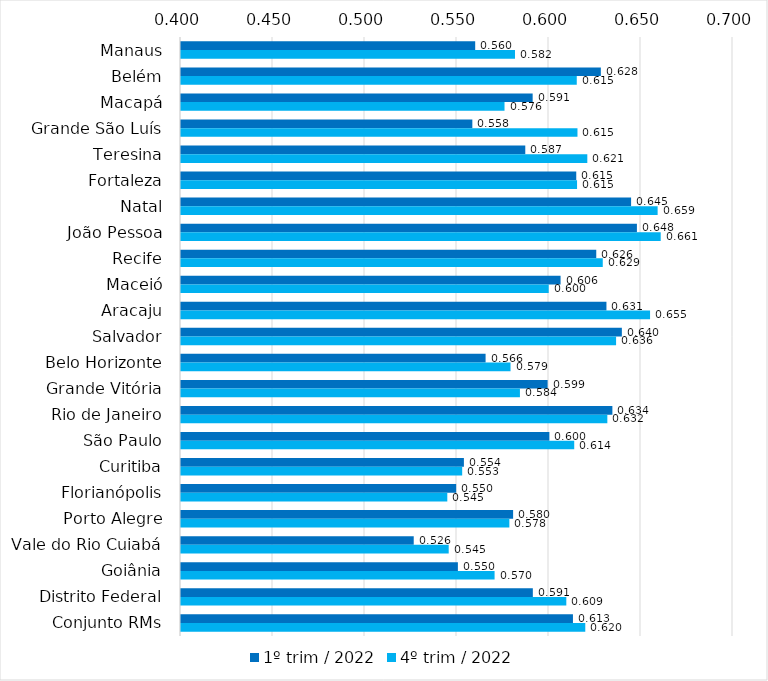
| Category | 1º trim / 2022 | 4º trim / 2022 |
|---|---|---|
| Manaus | 0.56 | 0.582 |
| Belém | 0.628 | 0.615 |
| Macapá | 0.591 | 0.576 |
| Grande São Luís | 0.558 | 0.615 |
| Teresina | 0.587 | 0.621 |
| Fortaleza | 0.615 | 0.615 |
| Natal | 0.645 | 0.659 |
| João Pessoa | 0.648 | 0.661 |
| Recife | 0.626 | 0.629 |
| Maceió | 0.606 | 0.6 |
| Aracaju | 0.631 | 0.655 |
| Salvador | 0.64 | 0.636 |
| Belo Horizonte | 0.566 | 0.579 |
| Grande Vitória | 0.599 | 0.584 |
| Rio de Janeiro | 0.634 | 0.632 |
| São Paulo | 0.6 | 0.614 |
| Curitiba | 0.554 | 0.553 |
| Florianópolis | 0.55 | 0.545 |
| Porto Alegre | 0.58 | 0.578 |
| Vale do Rio Cuiabá | 0.526 | 0.545 |
| Goiânia | 0.55 | 0.57 |
| Distrito Federal | 0.591 | 0.609 |
| Conjunto RMs | 0.613 | 0.62 |